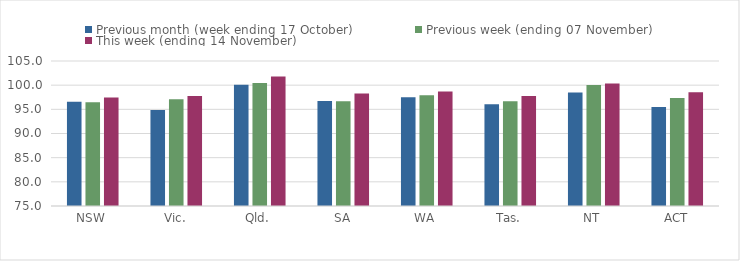
| Category | Previous month (week ending 17 October) | Previous week (ending 07 November) | This week (ending 14 November) |
|---|---|---|---|
| NSW | 96.56 | 96.47 | 97.47 |
| Vic. | 94.86 | 97.1 | 97.74 |
| Qld. | 100.1 | 100.47 | 101.77 |
| SA | 96.75 | 96.67 | 98.27 |
| WA | 97.48 | 97.91 | 98.68 |
| Tas. | 96.06 | 96.65 | 97.76 |
| NT | 98.46 | 100.03 | 100.32 |
| ACT | 95.46 | 97.34 | 98.55 |